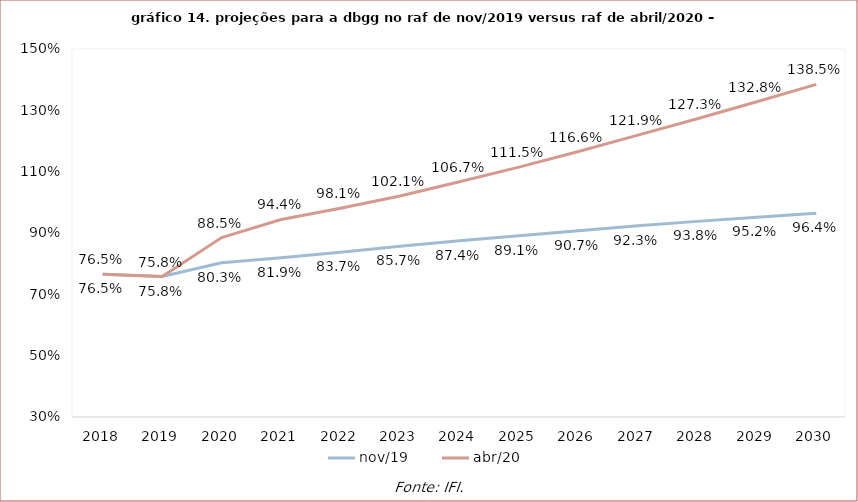
| Category | nov/19 | abr/20 |
|---|---|---|
| 2018.0 | 0.765 | 0.765 |
| 2019.0 | 0.758 | 0.758 |
| 2020.0 | 0.803 | 0.885 |
| 2021.0 | 0.819 | 0.944 |
| 2022.0 | 0.837 | 0.981 |
| 2023.0 | 0.857 | 1.021 |
| 2024.0 | 0.874 | 1.067 |
| 2025.0 | 0.891 | 1.115 |
| 2026.0 | 0.907 | 1.166 |
| 2027.0 | 0.923 | 1.219 |
| 2028.0 | 0.938 | 1.273 |
| 2029.0 | 0.952 | 1.328 |
| 2030.0 | 0.964 | 1.385 |